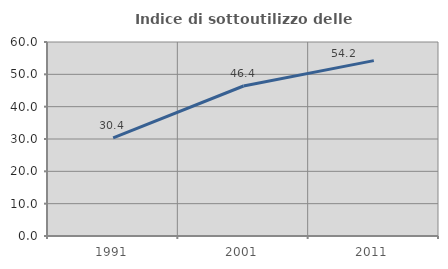
| Category | Indice di sottoutilizzo delle abitazioni  |
|---|---|
| 1991.0 | 30.375 |
| 2001.0 | 46.392 |
| 2011.0 | 54.237 |